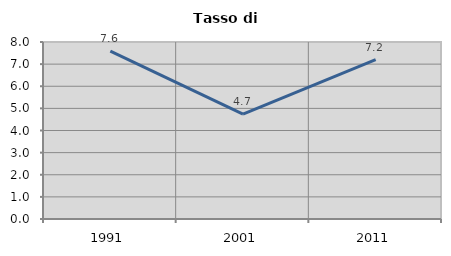
| Category | Tasso di disoccupazione   |
|---|---|
| 1991.0 | 7.592 |
| 2001.0 | 4.741 |
| 2011.0 | 7.199 |